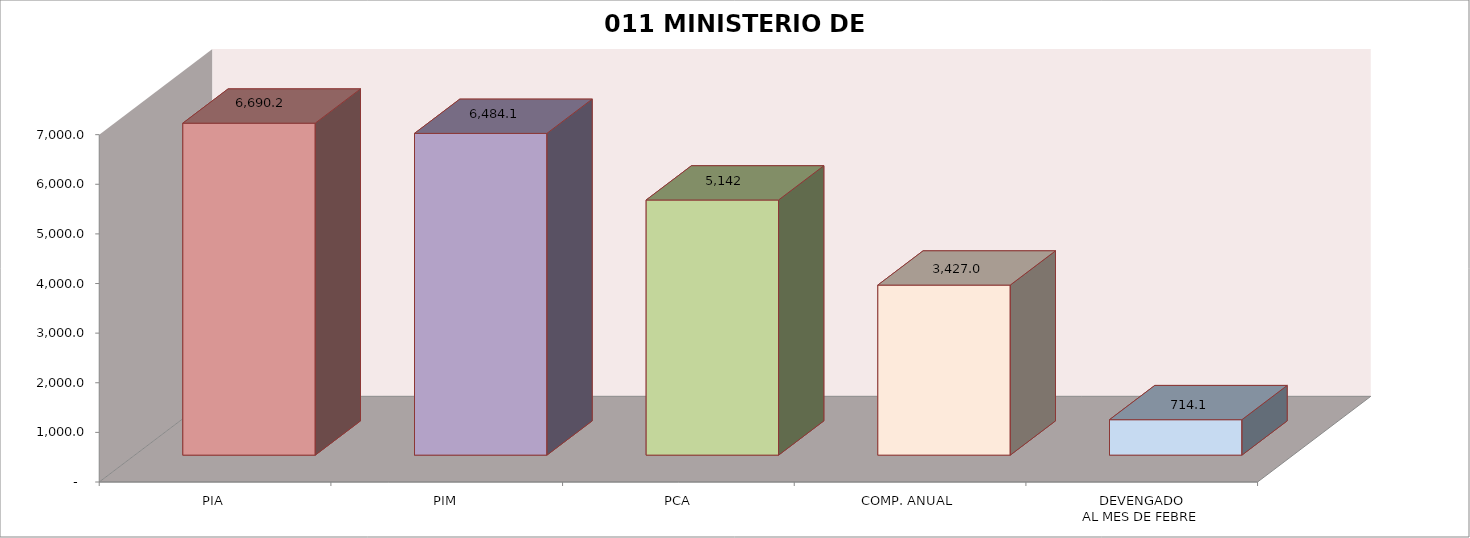
| Category | 011 MINISTERIO DE SALUD |
|---|---|
| PIA | 6690.187 |
| PIM | 6484.103 |
| PCA | 5141.844 |
| COMP. ANUAL | 3427.015 |
| DEVENGADO
AL MES DE FEBRE | 714.115 |